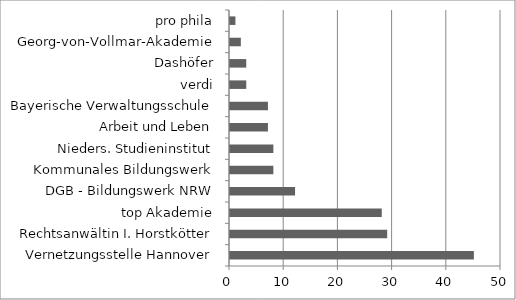
| Category | Series 0 |
|---|---|
| Vernetzungsstelle Hannover | 45 |
| Rechtsanwältin I. Horstkötter | 29 |
| top Akademie | 28 |
| DGB - Bildungswerk NRW | 12 |
| Kommunales Bildungswerk | 8 |
| Nieders. Studieninstitut | 8 |
| Arbeit und Leben | 7 |
| Bayerische Verwaltungsschule | 7 |
| verdi | 3 |
| Dashöfer | 3 |
| Georg-von-Vollmar-Akademie | 2 |
| pro phila | 1 |